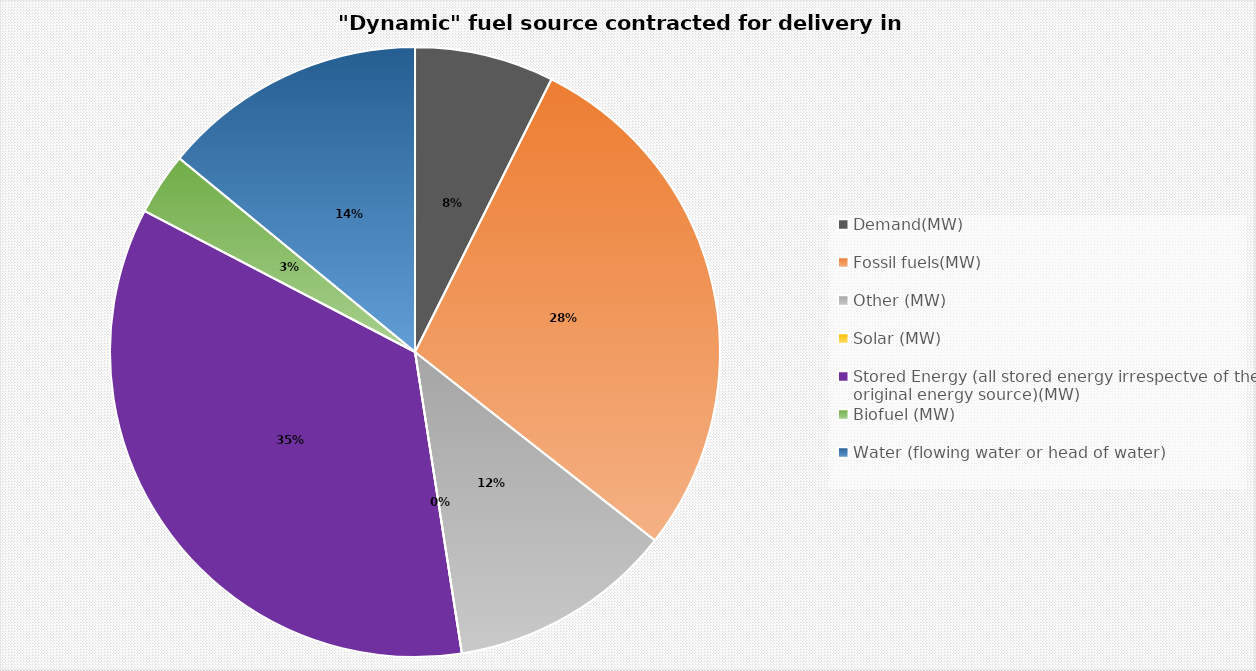
| Category | Dynamic fuel source contracted for delivery in 22/23 |
|---|---|
| Demand(MW) | 74.947 |
| Fossil fuels(MW) | 286.375 |
| Other (MW) | 121.309 |
| Solar (MW) | 0 |
| Stored Energy (all stored energy irrespectve of the original energy source)(MW) | 356.336 |
| Biofuel (MW) | 33.5 |
| Water (flowing water or head of water) | 142.65 |